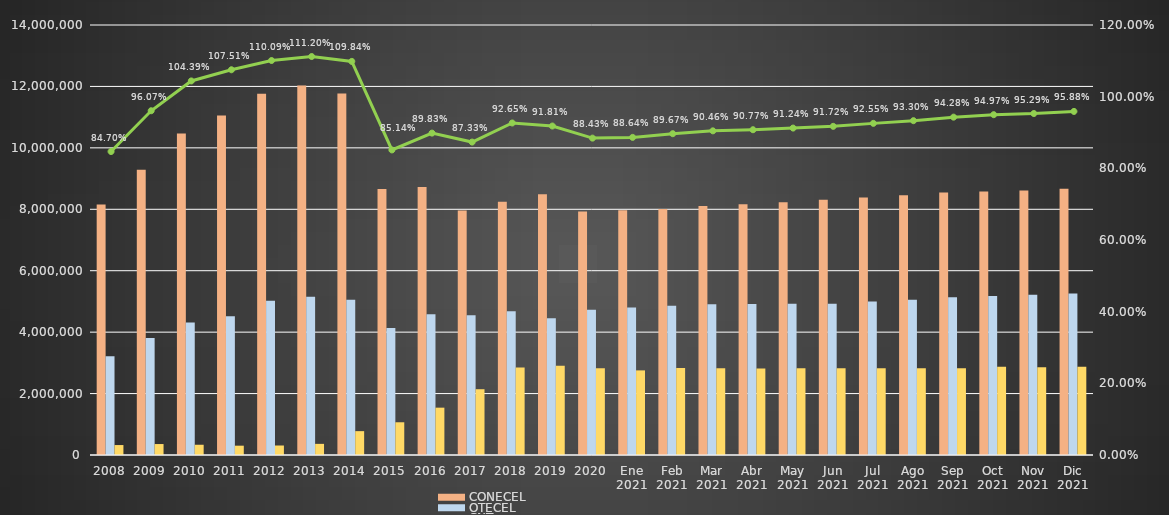
| Category | CONECEL | OTECEL | CNT |
|---|---|---|---|
| 2008 | 8156359 | 3211922 | 323967 |
| 2009 | 9291268 | 3806432 | 356900 |
| 2010 | 10470502 | 4314599 | 333730 |
| 2011 | 11057316 | 4513874 | 303368 |
| 2012 | 11757906 | 5019686 | 309271 |
| 2013 | 12030886 | 5148308 | 362560 |
| 2014 | 11772020 | 5055645 | 776892 |
| 2015 | 8658619 | 4134698 | 1065703 |
| 2016 | 8726823 | 4580092 | 1541219 |
| 2017 | 7960263 | 4549024 | 2142117 |
| 2018 | 8248050 | 4679646 | 2845142 |
| 2019 | 8493054 | 4456356 | 2903690 |
| 2020 | 7929253 | 4729725 | 2826388 |
| Ene 2021 | 7965274 | 4800608 | 2755177 |
| Feb 2021 | 8012894 | 4856877 | 2831764 |
| Mar 2021 | 8103873 | 4909433 | 2827246 |
| Abr 2021 | 8163884 | 4915830 | 2814894 |
| May 2021 | 8227613 | 4923245 | 2825401 |
| Jun 2021 | 8307915 | 4927307 | 2825401 |
| Jul 2021 | 8383604 | 4996675 | 2825401 |
| Ago 2021 | 8459659 | 5052880 | 2825401 |
| Sep 2021 | 8546668 | 5137764 | 2825401 |
| Oct 2021 | 8582141 | 5179337 | 2869251 |
| Nov 2021 | 8608545 | 5216577 | 2861029 |
| Dic 2021 | 8665715 | 5254468 | 2869417 |